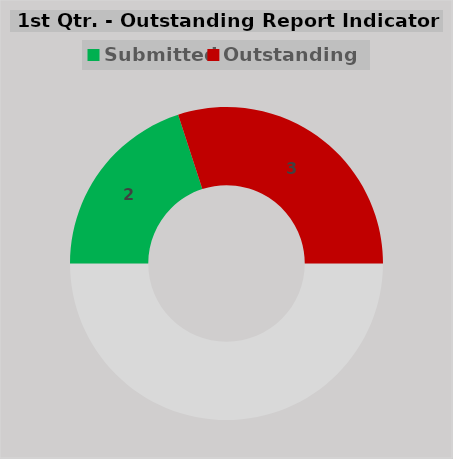
| Category | Series 0 |
|---|---|
|  | 5 |
| Submitted | 2 |
| Outstanding | 3 |